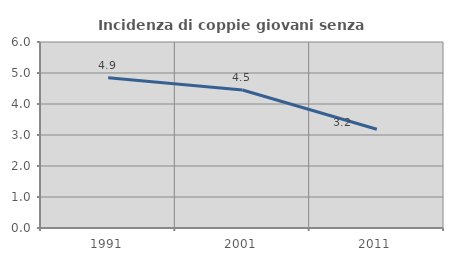
| Category | Incidenza di coppie giovani senza figli |
|---|---|
| 1991.0 | 4.85 |
| 2001.0 | 4.452 |
| 2011.0 | 3.185 |